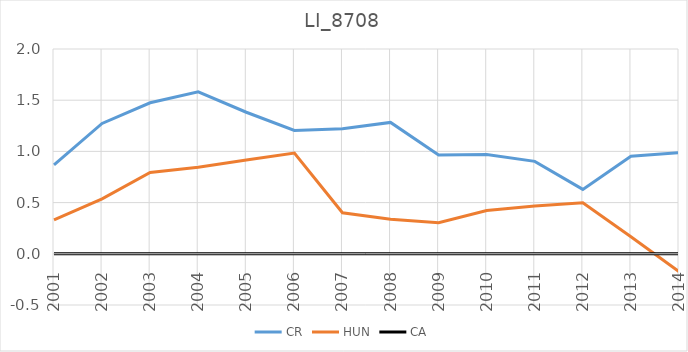
| Category | CR | HUN | CA |
|---|---|---|---|
| 2001.0 | 0.868 | 0.332 | 0 |
| 2002.0 | 1.273 | 0.536 | 0 |
| 2003.0 | 1.475 | 0.794 | 0 |
| 2004.0 | 1.582 | 0.846 | 0 |
| 2005.0 | 1.382 | 0.916 | 0 |
| 2006.0 | 1.205 | 0.983 | 0 |
| 2007.0 | 1.222 | 0.401 | 0 |
| 2008.0 | 1.283 | 0.337 | 0 |
| 2009.0 | 0.965 | 0.304 | 0 |
| 2010.0 | 0.97 | 0.424 | 0 |
| 2011.0 | 0.903 | 0.468 | 0 |
| 2012.0 | 0.629 | 0.498 | 0 |
| 2013.0 | 0.952 | 0.166 | 0 |
| 2014.0 | 0.988 | -0.174 | 0 |